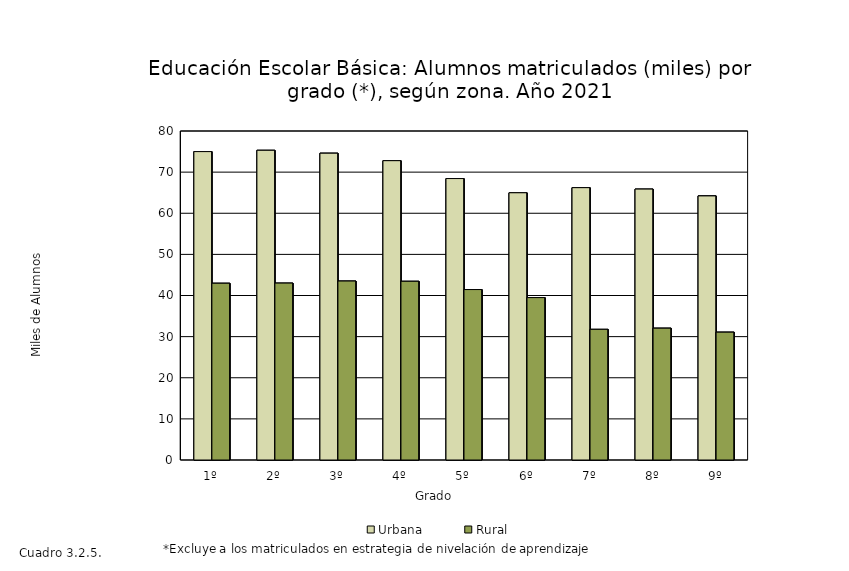
| Category | Urbana | Rural |
|---|---|---|
| 1º | 74.991 | 42.979 |
| 2º | 75.308 | 43.011 |
| 3º | 74.603 | 43.513 |
| 4º | 72.782 | 43.454 |
| 5º | 68.438 | 41.446 |
| 6º | 64.979 | 39.49 |
| 7º | 66.221 | 31.771 |
| 8º | 65.872 | 32.054 |
| 9º | 64.214 | 31.084 |